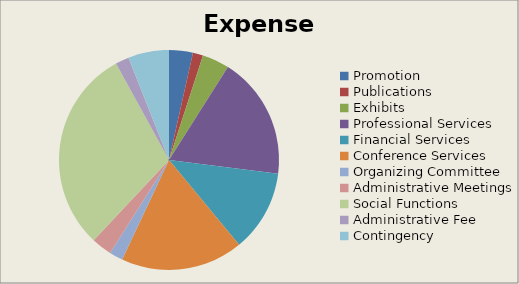
| Category | Expenses |
|---|---|
| Promotion | 0.035 |
| Publications | 0.015 |
| Exhibits | 0.04 |
| Professional Services | 0.18 |
| Financial Services | 0.12 |
| Conference Services | 0.18 |
| Organizing Committee | 0.02 |
| Administrative Meetings | 0.03 |
| Social Functions | 0.3 |
| Administrative Fee | 0.02 |
| Contingency | 0.06 |